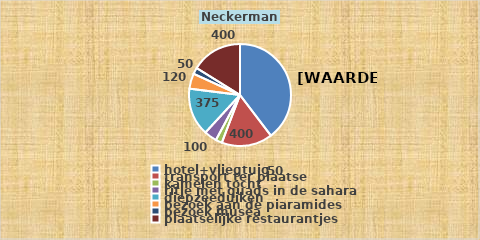
| Category | Series 0 | Series 1 | Series 2 |
|---|---|---|---|
| hotel+vliegtuig |  | 982 | 8347 |
| transport ter plaatse |  | 400 | 3400 |
| kamelen tocht  |  | 50 | 425 |
| ritje met quads in de sahara |  | 100 | 850 |
| diepzeeduiken |  | 375 | 3187.5 |
| bezoek aan de piaramides |  | 120 | 1020 |
| bezoek musea |  | 50 | 425 |
| plaatselijke restaurantjes |  | 400 | 3400 |